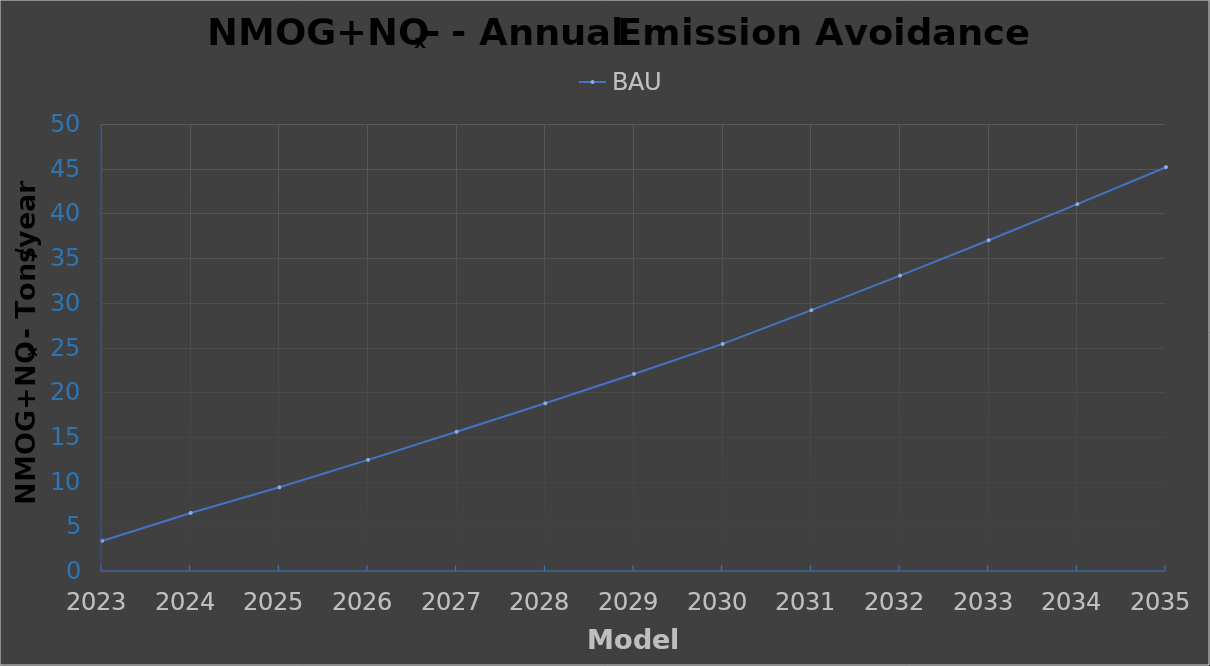
| Category | BAU |
|---|---|
| 2023.0 | 3.359 |
| 2024.0 | 6.495 |
| 2025.0 | 9.361 |
| 2026.0 | 12.432 |
| 2027.0 | 15.575 |
| 2028.0 | 18.762 |
| 2029.0 | 22.038 |
| 2030.0 | 25.399 |
| 2031.0 | 29.174 |
| 2032.0 | 33.044 |
| 2033.0 | 36.994 |
| 2034.0 | 41.037 |
| 2035.0 | 45.174 |